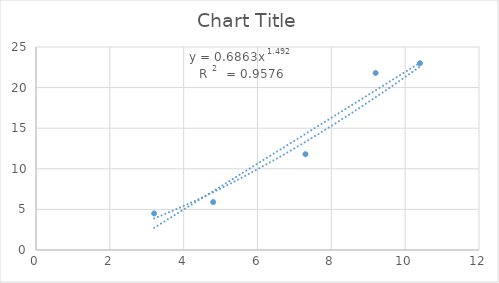
| Category | Series 0 |
|---|---|
| 3.2 | 4.5 |
| 4.8 | 5.9 |
| 7.3 | 11.8 |
| 9.2 | 21.8 |
| 10.4 | 23 |